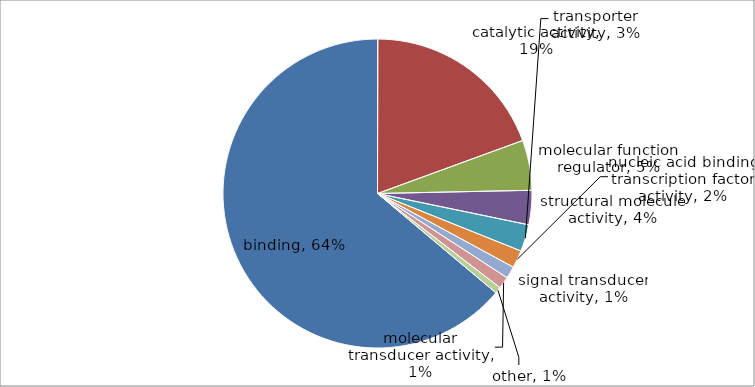
| Category | Series 0 |
|---|---|
| binding | 659 |
| catalytic activity | 200 |
| molecular function regulator | 54 |
| structural molecule activity | 37 |
| transporter activity | 29 |
| nucleic acid binding transcription factor activity | 19 |
| signal transducer activity | 13 |
| molecular transducer activity | 13 |
| other | 7 |